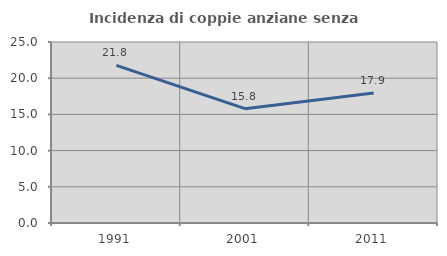
| Category | Incidenza di coppie anziane senza figli  |
|---|---|
| 1991.0 | 21.774 |
| 2001.0 | 15.789 |
| 2011.0 | 17.949 |